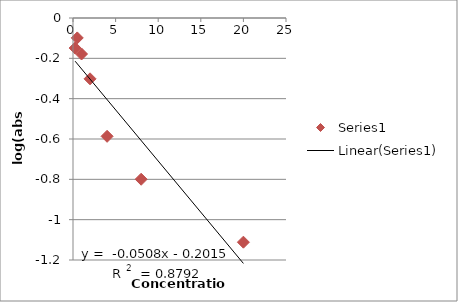
| Category | Series 0 |
|---|---|
| 20.0 | -1.112 |
| 8.0 | -0.8 |
| 4.0 | -0.587 |
| 2.0 | -0.302 |
| 1.0 | -0.178 |
| 0.5 | -0.099 |
| 0.25 | -0.149 |